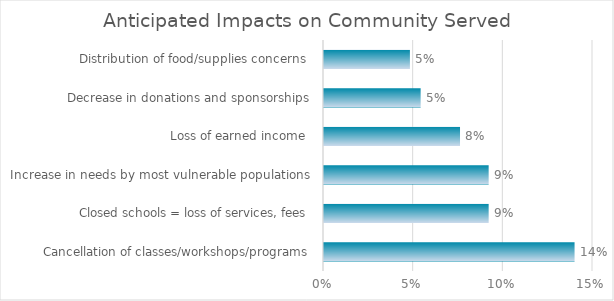
| Category | Total | Total % |
|---|---|---|
| Cancellation of classes/workshops/programs |  | 0.14 |
| Closed schools = loss of services, fees |  | 0.092 |
| Increase in needs by most vulnerable populations |  | 0.092 |
| Loss of earned income  |  | 0.076 |
| Decrease in donations and sponsorships |  | 0.054 |
| Distribution of food/supplies concerns  |  | 0.048 |